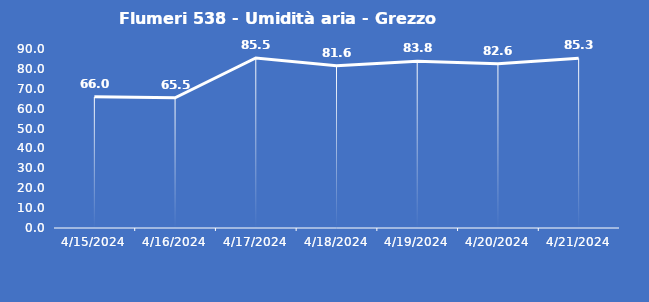
| Category | Flumeri 538 - Umidità aria - Grezzo (%) |
|---|---|
| 4/15/24 | 66 |
| 4/16/24 | 65.5 |
| 4/17/24 | 85.5 |
| 4/18/24 | 81.6 |
| 4/19/24 | 83.8 |
| 4/20/24 | 82.6 |
| 4/21/24 | 85.3 |